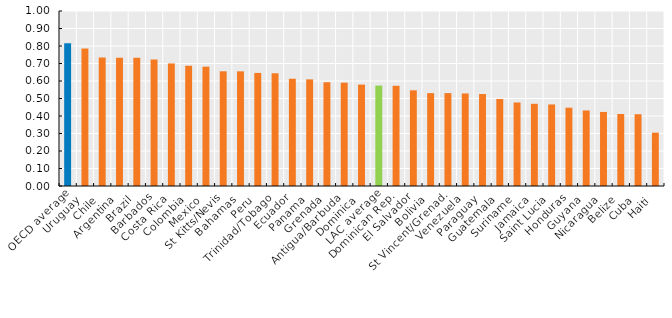
| Category | Series 0 |
|---|---|
| OECD average | 0.816 |
| Uruguay  | 0.786 |
| Chile  | 0.735 |
| Argentina  | 0.734 |
| Brazil  | 0.733 |
| Barbados  | 0.723 |
| Costa Rica  | 0.7 |
| Colombia  | 0.687 |
| Mexico  | 0.682 |
| St Kitts/Nevis | 0.655 |
| Bahamas  | 0.655 |
| Peru  | 0.646 |
| Trinidad/Tobago  | 0.644 |
| Ecuador  | 0.613 |
| Panama  | 0.609 |
| Grenada  | 0.593 |
| Antigua/Barbuda  | 0.591 |
| Dominica  | 0.579 |
| LAC average | 0.574 |
| Dominican Rep. | 0.573 |
| El Salvador  | 0.547 |
| Bolivia  | 0.531 |
| St Vincent/Grenad. | 0.531 |
| Venezuela  | 0.529 |
| Paraguay  | 0.526 |
| Guatemala  | 0.497 |
| Suriname  | 0.477 |
| Jamaica  | 0.47 |
| Saint Lucia  | 0.466 |
| Honduras  | 0.447 |
| Guyana  | 0.432 |
| Nicaragua  | 0.423 |
| Belize  | 0.412 |
| Cuba  | 0.41 |
| Haiti  | 0.305 |